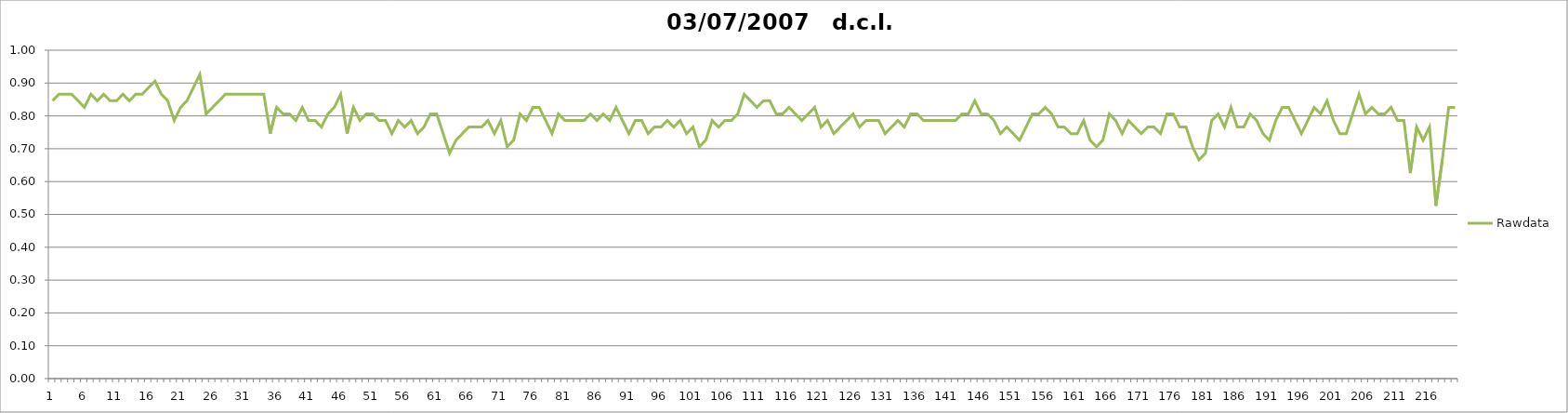
| Category | Rawdata |
|---|---|
| 0 | 0.846 |
| 1 | 0.866 |
| 2 | 0.866 |
| 3 | 0.866 |
| 4 | 0.846 |
| 5 | 0.826 |
| 6 | 0.866 |
| 7 | 0.846 |
| 8 | 0.866 |
| 9 | 0.846 |
| 10 | 0.846 |
| 11 | 0.866 |
| 12 | 0.846 |
| 13 | 0.866 |
| 14 | 0.866 |
| 15 | 0.886 |
| 16 | 0.906 |
| 17 | 0.866 |
| 18 | 0.846 |
| 19 | 0.786 |
| 20 | 0.826 |
| 21 | 0.846 |
| 22 | 0.886 |
| 23 | 0.926 |
| 24 | 0.806 |
| 25 | 0.826 |
| 26 | 0.846 |
| 27 | 0.866 |
| 28 | 0.866 |
| 29 | 0.866 |
| 30 | 0.866 |
| 31 | 0.866 |
| 32 | 0.866 |
| 33 | 0.866 |
| 34 | 0.746 |
| 35 | 0.826 |
| 36 | 0.806 |
| 37 | 0.806 |
| 38 | 0.786 |
| 39 | 0.826 |
| 40 | 0.786 |
| 41 | 0.786 |
| 42 | 0.766 |
| 43 | 0.806 |
| 44 | 0.826 |
| 45 | 0.866 |
| 46 | 0.746 |
| 47 | 0.826 |
| 48 | 0.786 |
| 49 | 0.806 |
| 50 | 0.806 |
| 51 | 0.786 |
| 52 | 0.786 |
| 53 | 0.746 |
| 54 | 0.786 |
| 55 | 0.766 |
| 56 | 0.786 |
| 57 | 0.746 |
| 58 | 0.766 |
| 59 | 0.806 |
| 60 | 0.806 |
| 61 | 0.746 |
| 62 | 0.686 |
| 63 | 0.726 |
| 64 | 0.746 |
| 65 | 0.766 |
| 66 | 0.766 |
| 67 | 0.766 |
| 68 | 0.786 |
| 69 | 0.746 |
| 70 | 0.786 |
| 71 | 0.706 |
| 72 | 0.726 |
| 73 | 0.806 |
| 74 | 0.786 |
| 75 | 0.826 |
| 76 | 0.826 |
| 77 | 0.786 |
| 78 | 0.746 |
| 79 | 0.806 |
| 80 | 0.786 |
| 81 | 0.786 |
| 82 | 0.786 |
| 83 | 0.786 |
| 84 | 0.806 |
| 85 | 0.786 |
| 86 | 0.806 |
| 87 | 0.786 |
| 88 | 0.826 |
| 89 | 0.786 |
| 90 | 0.746 |
| 91 | 0.786 |
| 92 | 0.786 |
| 93 | 0.746 |
| 94 | 0.766 |
| 95 | 0.766 |
| 96 | 0.786 |
| 97 | 0.766 |
| 98 | 0.786 |
| 99 | 0.746 |
| 100 | 0.766 |
| 101 | 0.706 |
| 102 | 0.726 |
| 103 | 0.786 |
| 104 | 0.766 |
| 105 | 0.786 |
| 106 | 0.786 |
| 107 | 0.806 |
| 108 | 0.866 |
| 109 | 0.846 |
| 110 | 0.826 |
| 111 | 0.846 |
| 112 | 0.846 |
| 113 | 0.806 |
| 114 | 0.806 |
| 115 | 0.826 |
| 116 | 0.806 |
| 117 | 0.786 |
| 118 | 0.806 |
| 119 | 0.826 |
| 120 | 0.766 |
| 121 | 0.786 |
| 122 | 0.746 |
| 123 | 0.766 |
| 124 | 0.786 |
| 125 | 0.806 |
| 126 | 0.766 |
| 127 | 0.786 |
| 128 | 0.786 |
| 129 | 0.786 |
| 130 | 0.746 |
| 131 | 0.766 |
| 132 | 0.786 |
| 133 | 0.766 |
| 134 | 0.806 |
| 135 | 0.806 |
| 136 | 0.786 |
| 137 | 0.786 |
| 138 | 0.786 |
| 139 | 0.786 |
| 140 | 0.786 |
| 141 | 0.786 |
| 142 | 0.806 |
| 143 | 0.806 |
| 144 | 0.846 |
| 145 | 0.806 |
| 146 | 0.806 |
| 147 | 0.786 |
| 148 | 0.746 |
| 149 | 0.766 |
| 150 | 0.746 |
| 151 | 0.726 |
| 152 | 0.766 |
| 153 | 0.806 |
| 154 | 0.806 |
| 155 | 0.826 |
| 156 | 0.806 |
| 157 | 0.766 |
| 158 | 0.766 |
| 159 | 0.746 |
| 160 | 0.746 |
| 161 | 0.786 |
| 162 | 0.726 |
| 163 | 0.706 |
| 164 | 0.726 |
| 165 | 0.806 |
| 166 | 0.786 |
| 167 | 0.746 |
| 168 | 0.786 |
| 169 | 0.766 |
| 170 | 0.746 |
| 171 | 0.766 |
| 172 | 0.766 |
| 173 | 0.746 |
| 174 | 0.806 |
| 175 | 0.806 |
| 176 | 0.766 |
| 177 | 0.766 |
| 178 | 0.706 |
| 179 | 0.666 |
| 180 | 0.686 |
| 181 | 0.786 |
| 182 | 0.806 |
| 183 | 0.766 |
| 184 | 0.826 |
| 185 | 0.766 |
| 186 | 0.766 |
| 187 | 0.806 |
| 188 | 0.786 |
| 189 | 0.746 |
| 190 | 0.726 |
| 191 | 0.786 |
| 192 | 0.826 |
| 193 | 0.826 |
| 194 | 0.786 |
| 195 | 0.746 |
| 196 | 0.786 |
| 197 | 0.826 |
| 198 | 0.806 |
| 199 | 0.846 |
| 200 | 0.786 |
| 201 | 0.746 |
| 202 | 0.746 |
| 203 | 0.806 |
| 204 | 0.866 |
| 205 | 0.806 |
| 206 | 0.826 |
| 207 | 0.806 |
| 208 | 0.806 |
| 209 | 0.826 |
| 210 | 0.786 |
| 211 | 0.786 |
| 212 | 0.626 |
| 213 | 0.766 |
| 214 | 0.726 |
| 215 | 0.766 |
| 216 | 0.526 |
| 217 | 0.666 |
| 218 | 0.826 |
| 219 | 0.826 |